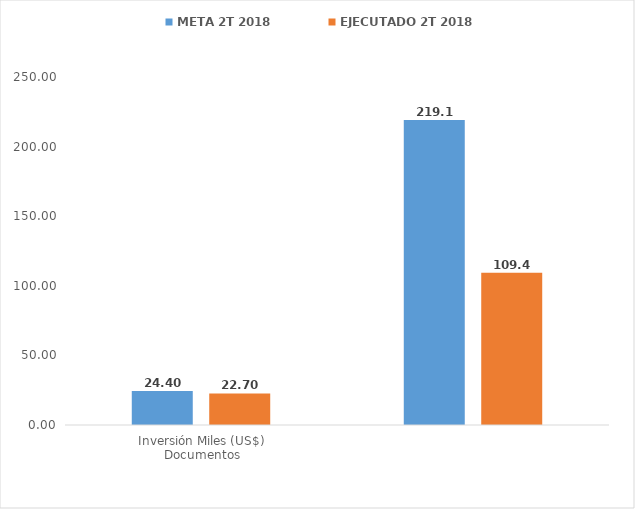
| Category | META 2T 2018 | EJECUTADO 2T 2018 |
|---|---|---|
| 0 | 24.4 | 22.7 |
| 1 | 219.082 | 109.444 |